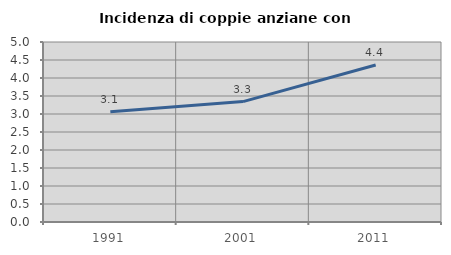
| Category | Incidenza di coppie anziane con figli |
|---|---|
| 1991.0 | 3.062 |
| 2001.0 | 3.344 |
| 2011.0 | 4.361 |